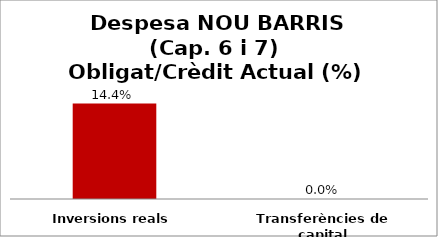
| Category | Series 0 |
|---|---|
| Inversions reals | 0.144 |
| Transferències de capital | 0 |